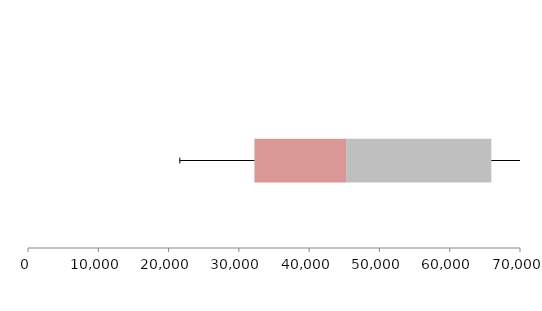
| Category | Series 1 | Series 2 | Series 3 |
|---|---|---|---|
| 0 | 32214.853 | 13035.953 | 20671.34 |